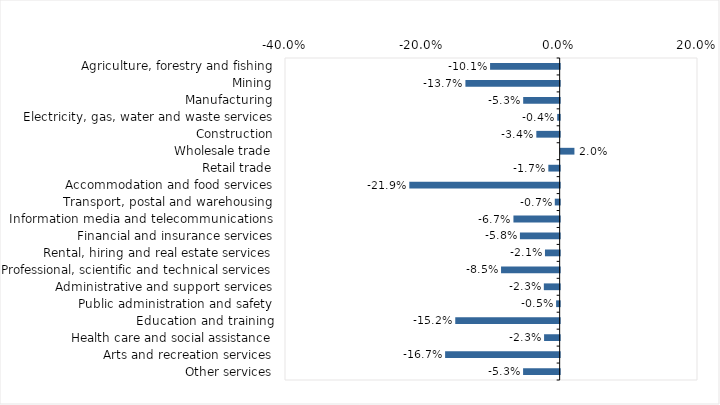
| Category | This week |
|---|---|
| Agriculture, forestry and fishing | -0.101 |
| Mining | -0.137 |
| Manufacturing | -0.053 |
| Electricity, gas, water and waste services | -0.004 |
| Construction | -0.034 |
| Wholesale trade | 0.02 |
| Retail trade | -0.017 |
| Accommodation and food services | -0.219 |
| Transport, postal and warehousing | -0.007 |
| Information media and telecommunications | -0.067 |
| Financial and insurance services | -0.058 |
| Rental, hiring and real estate services | -0.021 |
| Professional, scientific and technical services | -0.085 |
| Administrative and support services | -0.023 |
| Public administration and safety | -0.005 |
| Education and training | -0.152 |
| Health care and social assistance | -0.023 |
| Arts and recreation services | -0.167 |
| Other services | -0.053 |